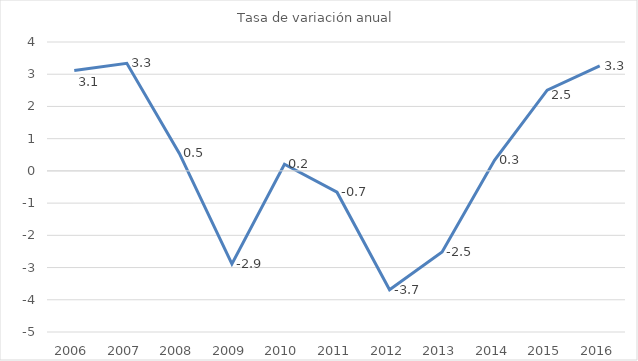
| Category | Tasa de variación anual |
|---|---|
| 2006.0 | 3.118 |
| 2007.0 | 3.337 |
| 2008.0 | 0.54 |
| 2009.0 | -2.888 |
| 2010.0 | 0.205 |
| 2011.0 | -0.662 |
| 2012.0 | -3.689 |
| 2013.0 | -2.514 |
| 2014.0 | 0.336 |
| 2015.0 | 2.507 |
| 2016.0 | 3.261 |